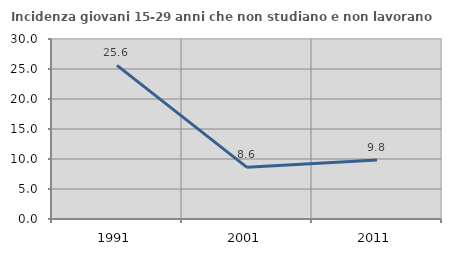
| Category | Incidenza giovani 15-29 anni che non studiano e non lavorano  |
|---|---|
| 1991.0 | 25.61 |
| 2001.0 | 8.607 |
| 2011.0 | 9.847 |